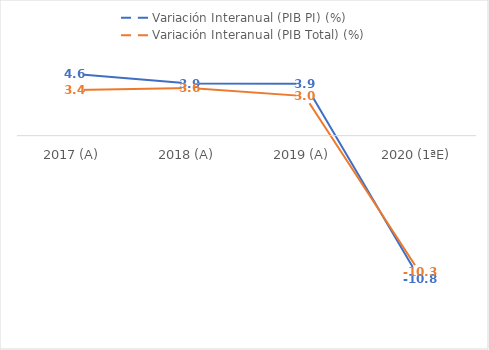
| Category | Variación Interanual (PIB PI) (%) | Variación Interanual (PIB Total) (%) |
|---|---|---|
| 2017 (A) | 4.635 | 3.43 |
| 2018 (A) | 3.92 | 3.586 |
| 2019 (A) | 3.906 | 2.98 |
| 2020 (1ªE) | -10.783 | -10.284 |